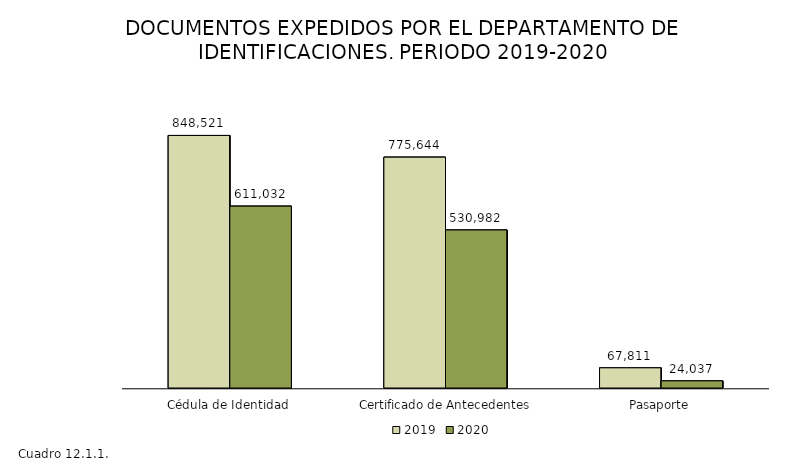
| Category | 2019 | 2020 |
|---|---|---|
| Cédula de Identidad | 848521 | 611032 |
| Certificado de Antecedentes | 775644 | 530982 |
| Pasaporte | 67811 | 24037 |